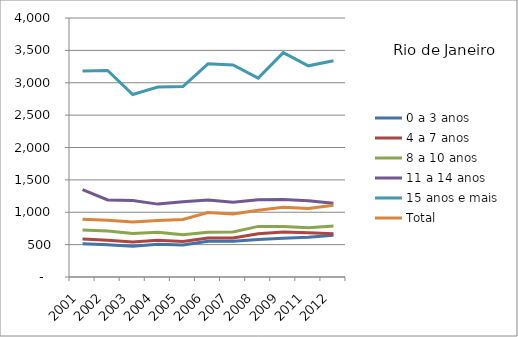
| Category | 0 a 3 anos | 4 a 7 anos | 8 a 10 anos | 11 a 14 anos | 15 anos e mais | Total |
|---|---|---|---|---|---|---|
| 2001.0 | 513.56 | 584.98 | 725.96 | 1350.39 | 3180.05 | 892.08 |
| 2002.0 | 498.48 | 568.35 | 711.01 | 1190.74 | 3190.15 | 875.09 |
| 2003.0 | 476.45 | 540.49 | 670.22 | 1179.8 | 2818.98 | 848.58 |
| 2004.0 | 505.85 | 568.37 | 690.9 | 1125.66 | 2935.17 | 871.72 |
| 2005.0 | 493.68 | 547.09 | 653.84 | 1162.29 | 2941.26 | 887.15 |
| 2006.0 | 552.26 | 601.48 | 692.04 | 1189.57 | 3292.69 | 996.64 |
| 2007.0 | 553.79 | 601.32 | 693.76 | 1152.66 | 3275.83 | 972.94 |
| 2008.0 | 578.7 | 666.87 | 781.51 | 1194.49 | 3071.64 | 1031.33 |
| 2009.0 | 597.93 | 693.41 | 780.58 | 1196.21 | 3465.07 | 1075.76 |
| 2011.0 | 615.69 | 682.44 | 761.44 | 1177.5 | 3261.44 | 1057.63 |
| 2012.0 | 643.05 | 669.87 | 788.84 | 1140.21 | 3340.28 | 1108.18 |